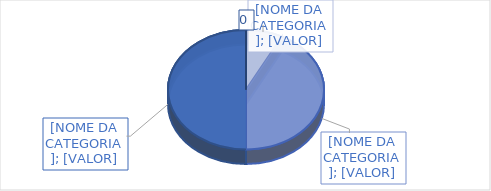
| Category | Series 0 |
|---|---|
| Clínica médica | 82 |
| Clinica cirúrgica | 457 |
| Total | 539 |